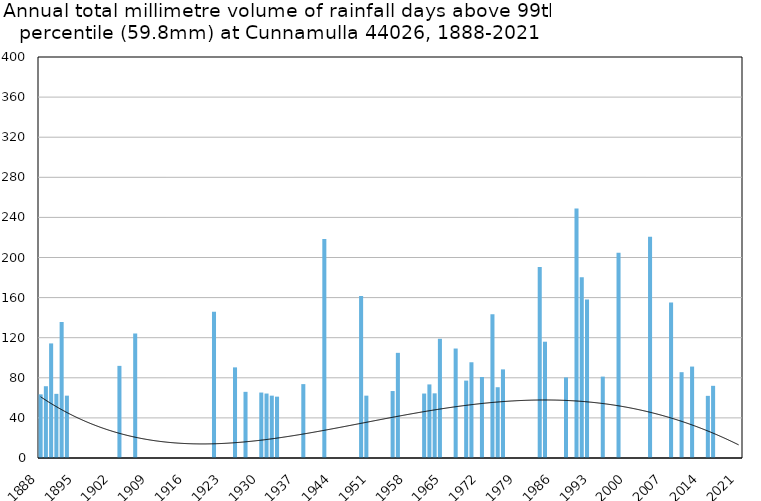
| Category | Annual total mm in days above 99th percentile |
|---|---|
| 1888 | 63.5 |
| 1889 | 71.6 |
| 1890 | 114.3 |
| 1891 | 64 |
| 1892 | 135.6 |
| 1893 | 62.2 |
| 1894 | 0 |
| 1895 | 0 |
| 1896 | 0 |
| 1897 | 0 |
| 1898 | 0 |
| 1899 | 0 |
| 1900 | 0 |
| 1901 | 0 |
| 1902 | 0 |
| 1903 | 91.9 |
| 1904 | 0 |
| 1905 | 0 |
| 1906 | 124.2 |
| 1907 | 0 |
| 1908 | 0 |
| 1909 | 0 |
| 1910 | 0 |
| 1911 | 0 |
| 1912 | 0 |
| 1913 | 0 |
| 1914 | 0 |
| 1915 | 0 |
| 1916 | 0 |
| 1917 | 0 |
| 1918 | 0 |
| 1919 | 0 |
| 1920 | 0 |
| 1921 | 145.8 |
| 1922 | 0 |
| 1923 | 0 |
| 1924 | 0 |
| 1925 | 90.4 |
| 1926 | 0 |
| 1927 | 66 |
| 1928 | 0 |
| 1929 | 0 |
| 1930 | 65.3 |
| 1931 | 64.3 |
| 1932 | 62.2 |
| 1933 | 61.2 |
| 1934 | 0 |
| 1935 | 0 |
| 1936 | 0 |
| 1937 | 0 |
| 1938 | 73.7 |
| 1939 | 0 |
| 1940 | 0 |
| 1941 | 0 |
| 1942 | 218.5 |
| 1943 | 0 |
| 1944 | 0 |
| 1945 | 0 |
| 1946 | 0 |
| 1947 | 0 |
| 1948 | 0 |
| 1949 | 161.6 |
| 1950 | 62.2 |
| 1951 | 0 |
| 1952 | 0 |
| 1953 | 0 |
| 1954 | 0 |
| 1955 | 66.8 |
| 1956 | 104.9 |
| 1957 | 0 |
| 1958 | 0 |
| 1959 | 0 |
| 1960 | 0 |
| 1961 | 64.3 |
| 1962 | 73.4 |
| 1963 | 64.5 |
| 1964 | 118.9 |
| 1965 | 0 |
| 1966 | 0 |
| 1967 | 109.2 |
| 1968 | 0 |
| 1969 | 77.2 |
| 1970 | 95.5 |
| 1971 | 0 |
| 1972 | 80.8 |
| 1973 | 0 |
| 1974 | 143.4 |
| 1975 | 70.6 |
| 1976 | 88.4 |
| 1977 | 0 |
| 1978 | 0 |
| 1979 | 0 |
| 1980 | 0 |
| 1981 | 0 |
| 1982 | 0 |
| 1983 | 190.6 |
| 1984 | 116 |
| 1985 | 0 |
| 1986 | 0 |
| 1987 | 0 |
| 1988 | 80.4 |
| 1989 | 0 |
| 1990 | 249 |
| 1991 | 180.4 |
| 1992 | 158 |
| 1993 | 0 |
| 1994 | 0 |
| 1995 | 81.2 |
| 1996 | 0 |
| 1997 | 0 |
| 1998 | 204.7 |
| 1999 | 0 |
| 2000 | 0 |
| 2001 | 0 |
| 2002 | 0 |
| 2003 | 0 |
| 2004 | 220.6 |
| 2005 | 0 |
| 2006 | 0 |
| 2007 | 0 |
| 2008 | 155.2 |
| 2009 | 0 |
| 2010 | 85.6 |
| 2011 | 0 |
| 2012 | 91.2 |
| 2013 | 0 |
| 2014 | 0 |
| 2015 | 62 |
| 2016 | 72 |
| 2017 | 0 |
| 2018 | 0 |
| 2019 | 0 |
| 2020 | 0 |
| 2021 | 0 |